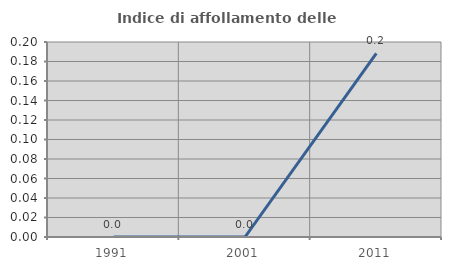
| Category | Indice di affollamento delle abitazioni  |
|---|---|
| 1991.0 | 0 |
| 2001.0 | 0 |
| 2011.0 | 0.188 |